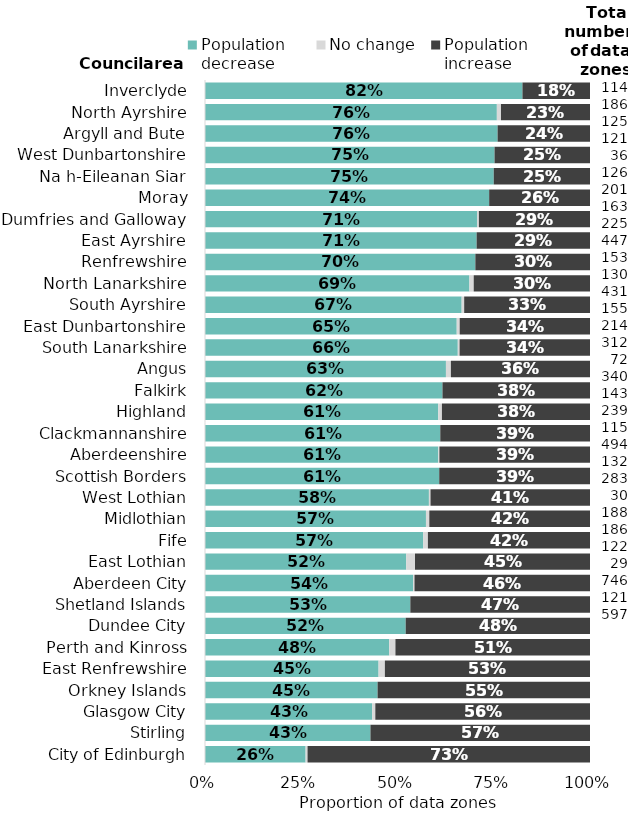
| Category | Population 
decrease | No change | Population 
increase |
|---|---|---|---|
| City of Edinburgh | 0.261 | 0.005 | 0.734 |
| Stirling | 0.43 | 0 | 0.57 |
| Glasgow City | 0.434 | 0.008 | 0.558 |
| Orkney Islands | 0.448 | 0 | 0.552 |
| East Renfrewshire | 0.451 | 0.016 | 0.533 |
| Perth and Kinross | 0.478 | 0.016 | 0.505 |
| Dundee City | 0.521 | 0 | 0.479 |
| Shetland Islands | 0.533 | 0 | 0.467 |
| Aberdeen City | 0.541 | 0.004 | 0.456 |
| East Lothian | 0.523 | 0.023 | 0.455 |
| Fife | 0.567 | 0.012 | 0.421 |
| Midlothian | 0.574 | 0.009 | 0.417 |
| West Lothian | 0.582 | 0.004 | 0.414 |
| Scottish Borders | 0.608 | 0 | 0.392 |
| Aberdeenshire | 0.606 | 0.003 | 0.391 |
| Clackmannanshire | 0.611 | 0 | 0.389 |
| Highland | 0.606 | 0.01 | 0.385 |
| Falkirk | 0.617 | 0 | 0.383 |
| Angus | 0.626 | 0.013 | 0.361 |
| South Lanarkshire | 0.657 | 0.005 | 0.339 |
| East Dunbartonshire | 0.654 | 0.008 | 0.338 |
| South Ayrshire | 0.667 | 0.007 | 0.327 |
| North Lanarkshire | 0.687 | 0.011 | 0.302 |
| Renfrewshire | 0.702 | 0 | 0.298 |
| East Ayrshire | 0.706 | 0 | 0.294 |
| Dumfries and Galloway | 0.706 | 0.005 | 0.289 |
| Moray | 0.738 | 0 | 0.262 |
| Na h-Eileanan Siar | 0.75 | 0 | 0.25 |
| West Dunbartonshire | 0.752 | 0 | 0.248 |
| Argyll and Bute | 0.76 | 0 | 0.24 |
| North Ayrshire | 0.758 | 0.011 | 0.231 |
| Inverclyde | 0.825 | 0 | 0.175 |